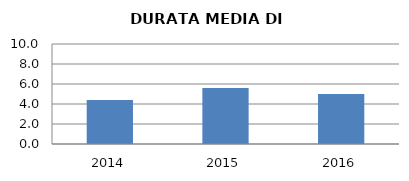
| Category | 2014 2015 2016 |
|---|---|
| 2014.0 | 4.4 |
| 2015.0 | 5.6 |
| 2016.0 | 5 |